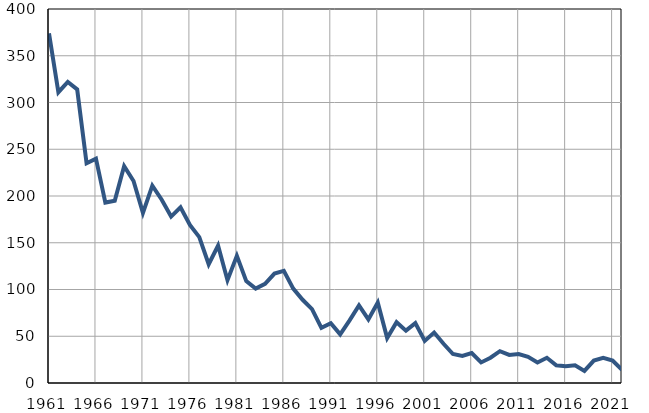
| Category | Умрла 
одојчад |
|---|---|
| 1961.0 | 374 |
| 1962.0 | 311 |
| 1963.0 | 322 |
| 1964.0 | 314 |
| 1965.0 | 235 |
| 1966.0 | 240 |
| 1967.0 | 193 |
| 1968.0 | 195 |
| 1969.0 | 232 |
| 1970.0 | 216 |
| 1971.0 | 182 |
| 1972.0 | 211 |
| 1973.0 | 196 |
| 1974.0 | 178 |
| 1975.0 | 188 |
| 1976.0 | 169 |
| 1977.0 | 156 |
| 1978.0 | 127 |
| 1979.0 | 147 |
| 1980.0 | 110 |
| 1981.0 | 136 |
| 1982.0 | 109 |
| 1983.0 | 101 |
| 1984.0 | 106 |
| 1985.0 | 117 |
| 1986.0 | 120 |
| 1987.0 | 101 |
| 1988.0 | 89 |
| 1989.0 | 79 |
| 1990.0 | 59 |
| 1991.0 | 64 |
| 1992.0 | 52 |
| 1993.0 | 67 |
| 1994.0 | 83 |
| 1995.0 | 68 |
| 1996.0 | 86 |
| 1997.0 | 48 |
| 1998.0 | 65 |
| 1999.0 | 56 |
| 2000.0 | 64 |
| 2001.0 | 45 |
| 2002.0 | 54 |
| 2003.0 | 42 |
| 2004.0 | 31 |
| 2005.0 | 29 |
| 2006.0 | 32 |
| 2007.0 | 22 |
| 2008.0 | 27 |
| 2009.0 | 34 |
| 2010.0 | 30 |
| 2011.0 | 31 |
| 2012.0 | 28 |
| 2013.0 | 22 |
| 2014.0 | 27 |
| 2015.0 | 19 |
| 2016.0 | 18 |
| 2017.0 | 19 |
| 2018.0 | 13 |
| 2019.0 | 24 |
| 2020.0 | 27 |
| 2021.0 | 24 |
| 2022.0 | 14 |